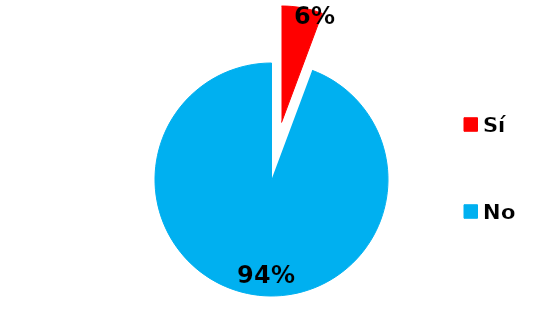
| Category | Series 0 |
|---|---|
| Sí | 5 |
| No | 83 |